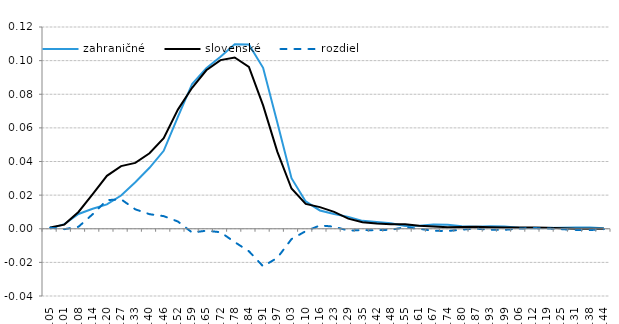
| Category | zahraničné | slovenské | rozdiel |
|---|---|---|---|
| -0.05172084 | 0 | 0.001 | 0.001 |
| 0.01220011 | 0.003 | 0.002 | 0 |
| 0.07612106 | 0.009 | 0.01 | 0.001 |
| 0.14004201 | 0.012 | 0.021 | 0.009 |
| 0.20396296 | 0.014 | 0.031 | 0.017 |
| 0.26788391 | 0.02 | 0.037 | 0.018 |
| 0.33180485 | 0.028 | 0.039 | 0.012 |
| 0.3957258 | 0.036 | 0.045 | 0.009 |
| 0.45964675 | 0.046 | 0.054 | 0.008 |
| 0.5235677 | 0.067 | 0.071 | 0.004 |
| 0.58748865 | 0.086 | 0.084 | -0.002 |
| 0.6514096 | 0.095 | 0.094 | -0.001 |
| 0.71533055 | 0.102 | 0.1 | -0.002 |
| 0.7792515 | 0.11 | 0.102 | -0.008 |
| 0.84317244 | 0.11 | 0.096 | -0.013 |
| 0.90709339 | 0.096 | 0.073 | -0.022 |
| 0.97101434 | 0.063 | 0.046 | -0.017 |
| 1.0349353 | 0.03 | 0.024 | -0.006 |
| 1.0988562 | 0.016 | 0.015 | -0.001 |
| 1.1627772 | 0.011 | 0.013 | 0.002 |
| 1.2266981 | 0.009 | 0.01 | 0.001 |
| 1.2906191 | 0.007 | 0.006 | -0.001 |
| 1.35454 | 0.005 | 0.004 | -0.001 |
| 1.418461 | 0.004 | 0.003 | -0.001 |
| 1.4823819 | 0.003 | 0.003 | -0.001 |
| 1.5463029 | 0.002 | 0.003 | 0.001 |
| 1.6102238 | 0.002 | 0.002 | 0 |
| 1.6741448 | 0.003 | 0.001 | -0.001 |
| 1.7380657 | 0.002 | 0.001 | -0.001 |
| 1.8019867 | 0.002 | 0.001 | -0.001 |
| 1.8659076 | 0.001 | 0.001 | 0 |
| 1.9298286 | 0.002 | 0.001 | -0.001 |
| 1.9937495 | 0.001 | 0.001 | -0.001 |
| 2.0576705 | 0.001 | 0.001 | 0 |
| 2.1215914 | 0 | 0.001 | 0 |
| 2.1855124 | 0 | 0.001 | 0 |
| 2.2494333 | 0.001 | 0 | 0 |
| 2.3133543 | 0.001 | 0 | -0.001 |
| 2.3772752 | 0.001 | 0 | -0.001 |
| 2.4411962 | 0 | 0 | 0 |